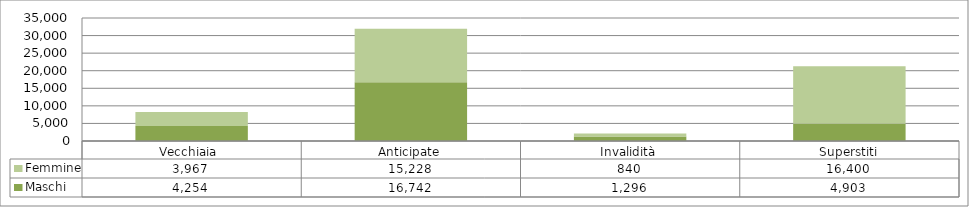
| Category | Maschi | Femmine |
|---|---|---|
| Vecchiaia  | 4254 | 3967 |
| Anticipate | 16742 | 15228 |
| Invalidità | 1296 | 840 |
| Superstiti | 4903 | 16400 |